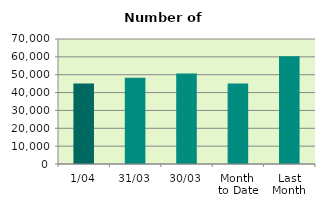
| Category | Series 0 |
|---|---|
| 1/04 | 45148 |
| 31/03 | 48304 |
| 30/03 | 50696 |
| Month 
to Date | 45148 |
| Last
Month | 60380.087 |